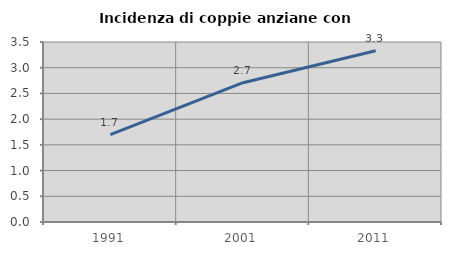
| Category | Incidenza di coppie anziane con figli |
|---|---|
| 1991.0 | 1.698 |
| 2001.0 | 2.709 |
| 2011.0 | 3.331 |